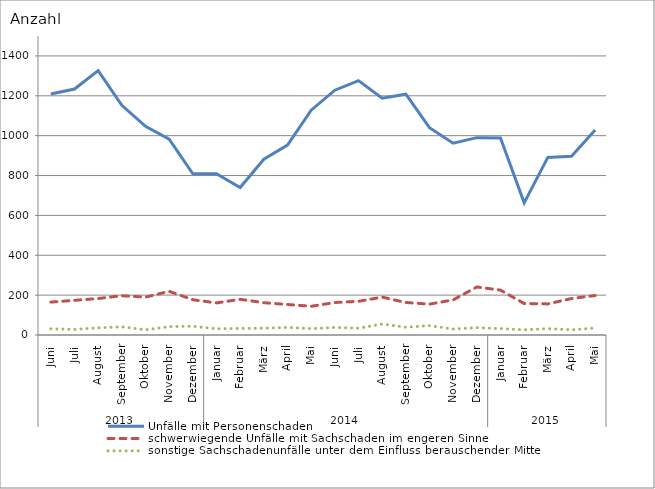
| Category | Unfälle mit Personenschaden | schwerwiegende Unfälle mit Sachschaden im engeren Sinne | sonstige Sachschadenunfälle unter dem Einfluss berauschender Mittel |
|---|---|---|---|
| 0 | 1209 | 165 | 31 |
| 1 | 1234 | 174 | 28 |
| 2 | 1326 | 183 | 36 |
| 3 | 1152 | 197 | 41 |
| 4 | 1047 | 190 | 26 |
| 5 | 983 | 219 | 42 |
| 6 | 809 | 177 | 44 |
| 7 | 809 | 161 | 31 |
| 8 | 740 | 179 | 33 |
| 9 | 882 | 162 | 34 |
| 10 | 953 | 153 | 38 |
| 11 | 1128 | 144 | 32 |
| 12 | 1228 | 163 | 38 |
| 13 | 1276 | 169 | 34 |
| 14 | 1188 | 190 | 55 |
| 15 | 1208 | 163 | 39 |
| 16 | 1040 | 155 | 47 |
| 17 | 962 | 176 | 30 |
| 18 | 990 | 241 | 37 |
| 19 | 988 | 225 | 32 |
| 20 | 663 | 158 | 26 |
| 21 | 891 | 156 | 32 |
| 22 | 897 | 183 | 26 |
| 23 | 1029 | 198 | 35 |